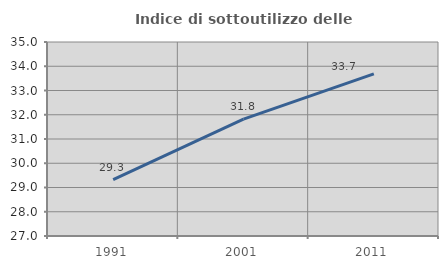
| Category | Indice di sottoutilizzo delle abitazioni  |
|---|---|
| 1991.0 | 29.327 |
| 2001.0 | 31.818 |
| 2011.0 | 33.688 |